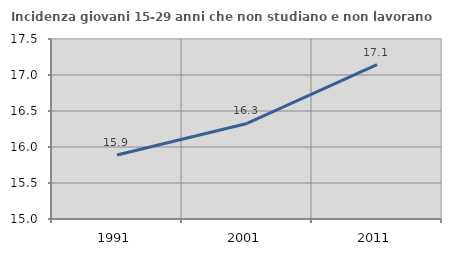
| Category | Incidenza giovani 15-29 anni che non studiano e non lavorano  |
|---|---|
| 1991.0 | 15.888 |
| 2001.0 | 16.327 |
| 2011.0 | 17.143 |